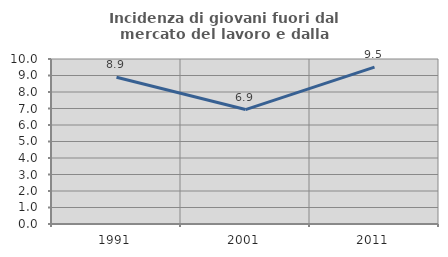
| Category | Incidenza di giovani fuori dal mercato del lavoro e dalla formazione  |
|---|---|
| 1991.0 | 8.895 |
| 2001.0 | 6.936 |
| 2011.0 | 9.509 |